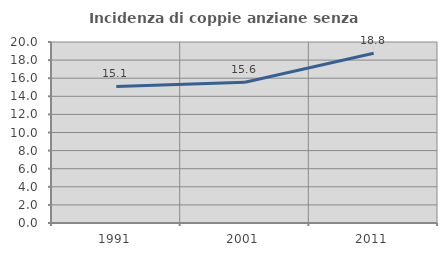
| Category | Incidenza di coppie anziane senza figli  |
|---|---|
| 1991.0 | 15.094 |
| 2001.0 | 15.556 |
| 2011.0 | 18.75 |